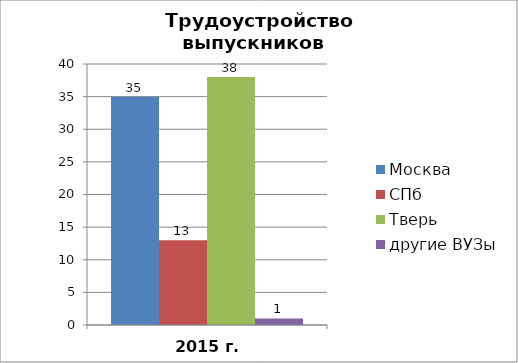
| Category | Москва | СПб | Тверь | другие ВУЗы |
|---|---|---|---|---|
| 2015 г. | 35 | 13 | 38 | 1 |